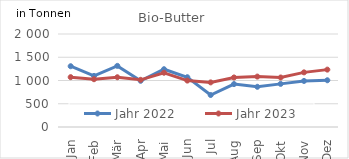
| Category | Jahr 2022 | Jahr 2023 |
|---|---|---|
| Jan | 1306.99 | 1072.039 |
| Feb | 1098.615 | 1027.438 |
| Mär | 1314.586 | 1070.043 |
| Apr | 993.57 | 1014.556 |
| Mai | 1242.451 | 1167.094 |
| Jun | 1070.426 | 998.294 |
| Jul | 688.106 | 959.195 |
| Aug | 922.967 | 1065.1 |
| Sep | 864.546 | 1084.243 |
| Okt | 927.275 | 1064.405 |
| Nov | 990.451 | 1175.055 |
| Dez | 1005.156 | 1233.858 |